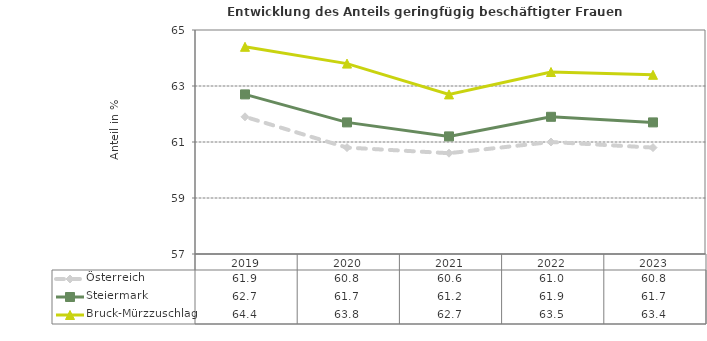
| Category | Österreich | Steiermark | Bruck-Mürzzuschlag |
|---|---|---|---|
| 2023.0 | 60.8 | 61.7 | 63.4 |
| 2022.0 | 61 | 61.9 | 63.5 |
| 2021.0 | 60.6 | 61.2 | 62.7 |
| 2020.0 | 60.8 | 61.7 | 63.8 |
| 2019.0 | 61.9 | 62.7 | 64.4 |